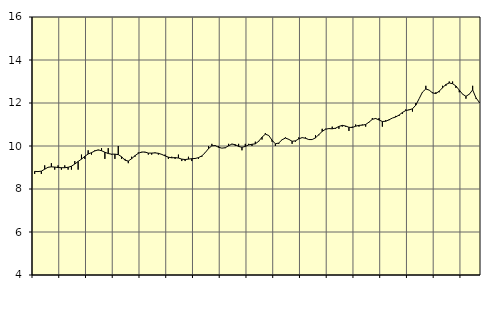
| Category | Piggar | Utbildning, SNI 85 |
|---|---|---|
| nan | 8.7 | 8.82 |
| 87.0 | 8.8 | 8.81 |
| 87.0 | 8.7 | 8.83 |
| 87.0 | 9.1 | 8.92 |
| nan | 9 | 9.01 |
| 88.0 | 9.2 | 9.03 |
| 88.0 | 8.9 | 9.02 |
| 88.0 | 9.1 | 9 |
| nan | 8.9 | 8.99 |
| 89.0 | 9.1 | 8.99 |
| 89.0 | 8.9 | 9.01 |
| 89.0 | 8.9 | 9.06 |
| nan | 9.3 | 9.16 |
| 90.0 | 8.9 | 9.28 |
| 90.0 | 9.6 | 9.39 |
| 90.0 | 9.4 | 9.52 |
| nan | 9.8 | 9.63 |
| 91.0 | 9.6 | 9.69 |
| 91.0 | 9.8 | 9.77 |
| 91.0 | 9.8 | 9.82 |
| nan | 9.9 | 9.78 |
| 92.0 | 9.4 | 9.71 |
| 92.0 | 9.9 | 9.65 |
| 92.0 | 9.6 | 9.62 |
| nan | 9.4 | 9.62 |
| 93.0 | 10 | 9.6 |
| 93.0 | 9.4 | 9.5 |
| 93.0 | 9.4 | 9.34 |
| nan | 9.2 | 9.3 |
| 94.0 | 9.5 | 9.41 |
| 94.0 | 9.5 | 9.55 |
| 94.0 | 9.7 | 9.66 |
| nan | 9.7 | 9.72 |
| 95.0 | 9.7 | 9.72 |
| 95.0 | 9.6 | 9.67 |
| 95.0 | 9.6 | 9.67 |
| nan | 9.7 | 9.68 |
| 96.0 | 9.6 | 9.66 |
| 96.0 | 9.6 | 9.61 |
| 96.0 | 9.6 | 9.54 |
| nan | 9.4 | 9.48 |
| 97.0 | 9.5 | 9.45 |
| 97.0 | 9.4 | 9.46 |
| 97.0 | 9.6 | 9.44 |
| nan | 9.3 | 9.39 |
| 98.0 | 9.3 | 9.37 |
| 98.0 | 9.5 | 9.39 |
| 98.0 | 9.3 | 9.41 |
| nan | 9.4 | 9.42 |
| 99.0 | 9.4 | 9.46 |
| 99.0 | 9.5 | 9.54 |
| 99.0 | 9.7 | 9.69 |
| nan | 10 | 9.88 |
| 0.0 | 10.1 | 10.01 |
| 0.0 | 10 | 10.02 |
| 0.0 | 10 | 9.94 |
| nan | 9.9 | 9.9 |
| 1.0 | 9.9 | 9.92 |
| 1.0 | 10.1 | 10.01 |
| 1.0 | 10.1 | 10.09 |
| nan | 10 | 10.06 |
| 2.0 | 10.1 | 9.98 |
| 2.0 | 9.8 | 9.94 |
| 2.0 | 10.1 | 9.98 |
| nan | 10.1 | 10.05 |
| 3.0 | 10 | 10.08 |
| 3.0 | 10.2 | 10.1 |
| 3.0 | 10.2 | 10.22 |
| nan | 10.3 | 10.41 |
| 4.0 | 10.6 | 10.55 |
| 4.0 | 10.5 | 10.49 |
| 4.0 | 10.2 | 10.27 |
| nan | 10 | 10.1 |
| 5.0 | 10.1 | 10.14 |
| 5.0 | 10.3 | 10.29 |
| 5.0 | 10.4 | 10.37 |
| nan | 10.3 | 10.31 |
| 6.0 | 10.1 | 10.22 |
| 6.0 | 10.2 | 10.24 |
| 6.0 | 10.4 | 10.33 |
| nan | 10.4 | 10.39 |
| 7.0 | 10.4 | 10.36 |
| 7.0 | 10.3 | 10.3 |
| 7.0 | 10.3 | 10.3 |
| nan | 10.5 | 10.38 |
| 8.0 | 10.5 | 10.53 |
| 8.0 | 10.8 | 10.68 |
| 8.0 | 10.8 | 10.78 |
| nan | 10.8 | 10.81 |
| 9.0 | 10.9 | 10.8 |
| 9.0 | 10.8 | 10.83 |
| 9.0 | 10.8 | 10.91 |
| nan | 10.9 | 10.96 |
| 10.0 | 10.9 | 10.93 |
| 10.0 | 10.7 | 10.87 |
| 10.0 | 10.9 | 10.86 |
| nan | 11 | 10.92 |
| 11.0 | 10.9 | 10.96 |
| 11.0 | 11 | 10.97 |
| 11.0 | 10.9 | 11 |
| nan | 11.1 | 11.11 |
| 12.0 | 11.3 | 11.24 |
| 12.0 | 11.3 | 11.28 |
| 12.0 | 11.3 | 11.21 |
| nan | 10.9 | 11.14 |
| 13.0 | 11.2 | 11.15 |
| 13.0 | 11.2 | 11.22 |
| 13.0 | 11.3 | 11.3 |
| nan | 11.4 | 11.35 |
| 14.0 | 11.4 | 11.44 |
| 14.0 | 11.5 | 11.56 |
| 14.0 | 11.7 | 11.65 |
| nan | 11.7 | 11.68 |
| 15.0 | 11.6 | 11.73 |
| 15.0 | 12 | 11.9 |
| 15.0 | 12.2 | 12.2 |
| nan | 12.5 | 12.51 |
| 16.0 | 12.8 | 12.65 |
| 16.0 | 12.6 | 12.6 |
| 16.0 | 12.5 | 12.47 |
| nan | 12.5 | 12.44 |
| 17.0 | 12.5 | 12.55 |
| 17.0 | 12.8 | 12.71 |
| 17.0 | 12.8 | 12.86 |
| nan | 13 | 12.93 |
| 18.0 | 13 | 12.9 |
| 18.0 | 12.7 | 12.79 |
| 18.0 | 12.5 | 12.6 |
| nan | 12.4 | 12.41 |
| 19.0 | 12.2 | 12.31 |
| 19.0 | 12.4 | 12.41 |
| 19.0 | 12.8 | 12.61 |
| nan | 12.2 | 12.24 |
| 20.0 | 12 | 12.03 |